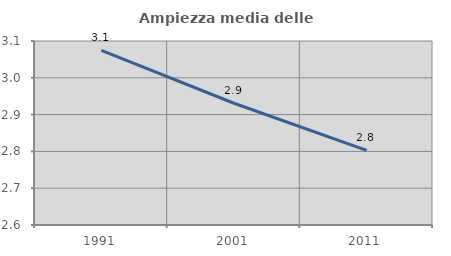
| Category | Ampiezza media delle famiglie |
|---|---|
| 1991.0 | 3.074 |
| 2001.0 | 2.931 |
| 2011.0 | 2.803 |